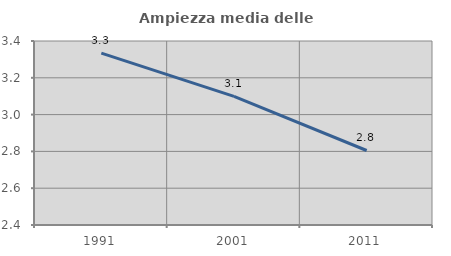
| Category | Ampiezza media delle famiglie |
|---|---|
| 1991.0 | 3.334 |
| 2001.0 | 3.099 |
| 2011.0 | 2.805 |